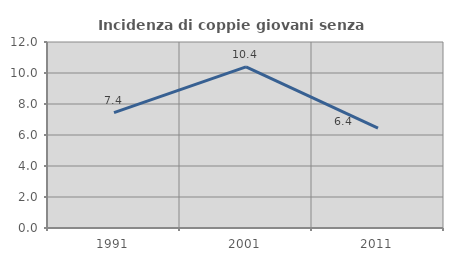
| Category | Incidenza di coppie giovani senza figli |
|---|---|
| 1991.0 | 7.447 |
| 2001.0 | 10.397 |
| 2011.0 | 6.439 |